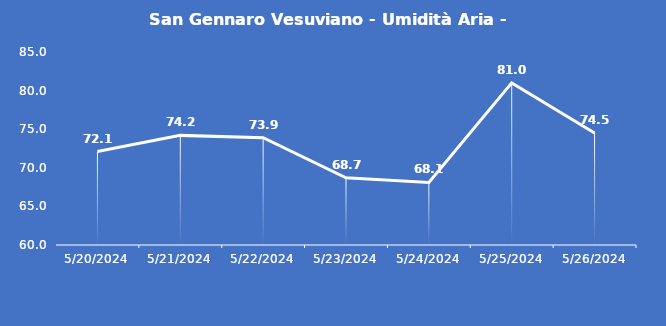
| Category | San Gennaro Vesuviano - Umidità Aria - Grezzo (%) |
|---|---|
| 5/20/24 | 72.1 |
| 5/21/24 | 74.2 |
| 5/22/24 | 73.9 |
| 5/23/24 | 68.7 |
| 5/24/24 | 68.1 |
| 5/25/24 | 81 |
| 5/26/24 | 74.5 |